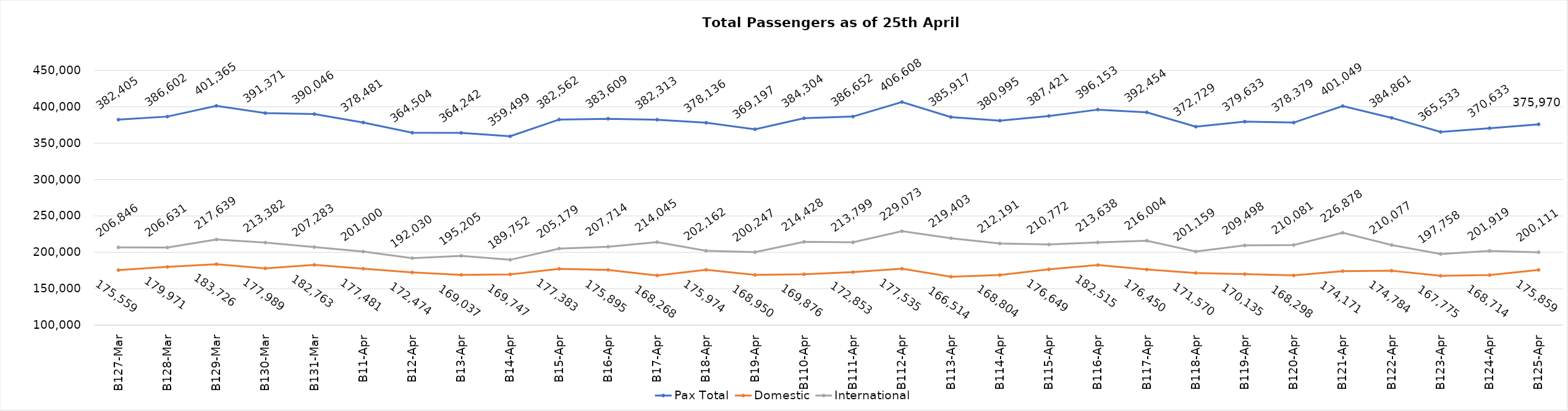
| Category | Pax Total | Domestic | International |
|---|---|---|---|
| 2024-03-27 | 382405 | 175559 | 206846 |
| 2024-03-28 | 386602 | 179971 | 206631 |
| 2024-03-29 | 401365 | 183726 | 217639 |
| 2024-03-30 | 391371 | 177989 | 213382 |
| 2024-03-31 | 390046 | 182763 | 207283 |
| 2024-04-01 | 378481 | 177481 | 201000 |
| 2024-04-02 | 364504 | 172474 | 192030 |
| 2024-04-03 | 364242 | 169037 | 195205 |
| 2024-04-04 | 359499 | 169747 | 189752 |
| 2024-04-05 | 382562 | 177383 | 205179 |
| 2024-04-06 | 383609 | 175895 | 207714 |
| 2024-04-07 | 382313 | 168268 | 214045 |
| 2024-04-08 | 378136 | 175974 | 202162 |
| 2024-04-09 | 369197 | 168950 | 200247 |
| 2024-04-10 | 384304 | 169876 | 214428 |
| 2024-04-11 | 386652 | 172853 | 213799 |
| 2024-04-12 | 406608 | 177535 | 229073 |
| 2024-04-13 | 385917 | 166514 | 219403 |
| 2024-04-14 | 380995 | 168804 | 212191 |
| 2024-04-15 | 387421 | 176649 | 210772 |
| 2024-04-16 | 396153 | 182515 | 213638 |
| 2024-04-17 | 392454 | 176450 | 216004 |
| 2024-04-18 | 372729 | 171570 | 201159 |
| 2024-04-19 | 379633 | 170135 | 209498 |
| 2024-04-20 | 378379 | 168298 | 210081 |
| 2024-04-21 | 401049 | 174171 | 226878 |
| 2024-04-22 | 384861 | 174784 | 210077 |
| 2024-04-23 | 365533 | 167775 | 197758 |
| 2024-04-24 | 370633 | 168714 | 201919 |
| 2024-04-25 | 375970 | 175859 | 200111 |